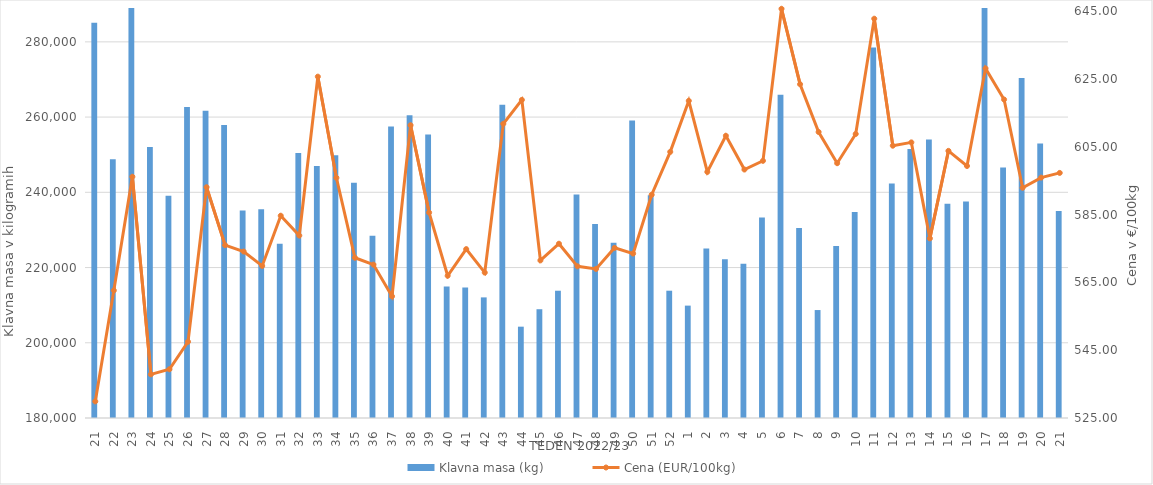
| Category | Klavna masa (kg) |
|---|---|
| 21.0 | 285073 |
| 22.0 | 248783 |
| 23.0 | 289478 |
| 24.0 | 252069 |
| 25.0 | 239099 |
| 26.0 | 262689 |
| 27.0 | 261656 |
| 28.0 | 257905 |
| 29.0 | 235185 |
| 30.0 | 235475 |
| 31.0 | 226322 |
| 32.0 | 250418 |
| 33.0 | 246996 |
| 34.0 | 249873 |
| 35.0 | 242516 |
| 36.0 | 228469 |
| 37.0 | 257511 |
| 38.0 | 260481 |
| 39.0 | 255370 |
| 40.0 | 214936 |
| 41.0 | 214672 |
| 42.0 | 212066 |
| 43.0 | 263287 |
| 44.0 | 204280 |
| 45.0 | 208920 |
| 46.0 | 213836 |
| 47.0 | 239417 |
| 48.0 | 231565 |
| 49.0 | 226575 |
| 50.0 | 259073 |
| 51.0 | 239211 |
| 52.0 | 213841 |
| 1.0 | 209877 |
| 2.0 | 225045 |
| 3.0 | 222198 |
| 4.0 | 221002 |
| 5.0 | 233306 |
| 6.0 | 265944 |
| 7.0 | 230531 |
| 8.0 | 208699 |
| 9.0 | 225712 |
| 10.0 | 234762 |
| 11.0 | 278467 |
| 12.0 | 242369 |
| 13.0 | 251507 |
| 14.0 | 254072 |
| 15.0 | 236964 |
| 16.0 | 237552 |
| 17.0 | 289400 |
| 18.0 | 246616 |
| 19.0 | 270374 |
| 20.0 | 252984 |
| 21.0 | 235060 |